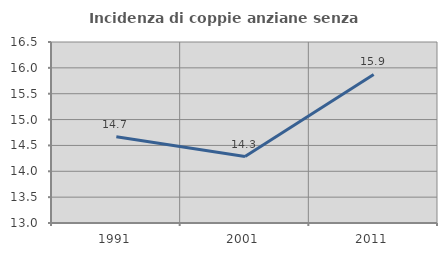
| Category | Incidenza di coppie anziane senza figli  |
|---|---|
| 1991.0 | 14.667 |
| 2001.0 | 14.286 |
| 2011.0 | 15.873 |